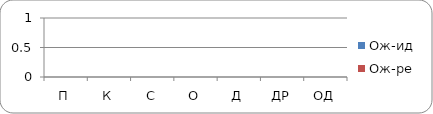
| Category | Ож-ид | Ож-ре |
|---|---|---|
| П | 0 | 0 |
| К | 0 | 0 |
| С | 0 | 0 |
| О | 0 | 0 |
| Д | 0 | 0 |
| ДР | 0 | 0 |
| ОД | 0 | 0 |